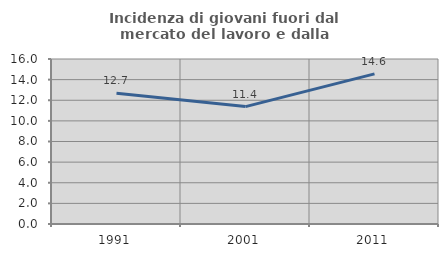
| Category | Incidenza di giovani fuori dal mercato del lavoro e dalla formazione  |
|---|---|
| 1991.0 | 12.681 |
| 2001.0 | 11.386 |
| 2011.0 | 14.557 |